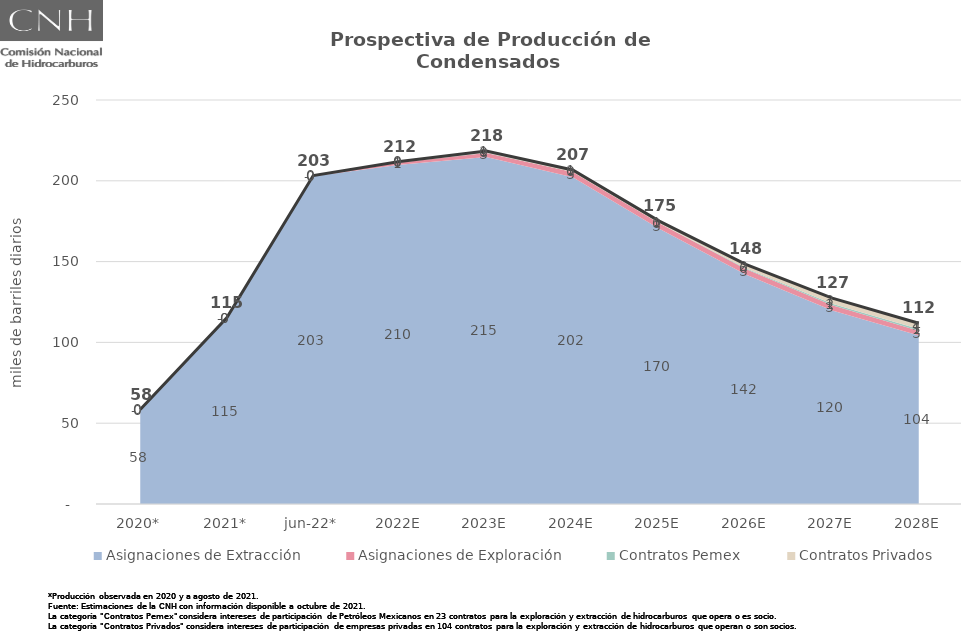
| Category | Total |
|---|---|
| 2020* | 58.421 |
| 2021* | 115.166 |
| jun-22* | 203.259 |
| 2022E | 211.938 |
| 2023E | 218.43 |
| 2024E | 206.725 |
| 2025E | 175.078 |
| 2026E | 148.259 |
| 2027E | 127.407 |
| 2028E | 111.862 |